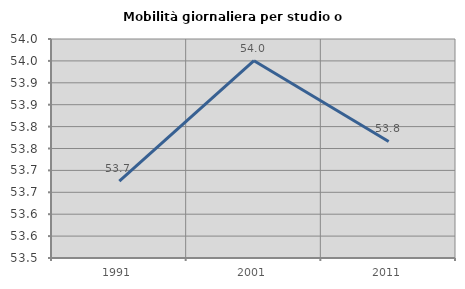
| Category | Mobilità giornaliera per studio o lavoro |
|---|---|
| 1991.0 | 53.676 |
| 2001.0 | 53.95 |
| 2011.0 | 53.766 |